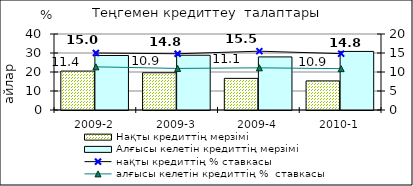
| Category | Нақты кредиттің мерзімі  | Алғысы келетін кредиттің мерзімі  |
|---|---|---|
| 2009-2 | 20.49 | 28.69 |
| 2009-3 | 19.59 | 28.82 |
| 2009-4 | 16.65 | 27.94 |
| 2010-1 | 15.31 | 30.83 |